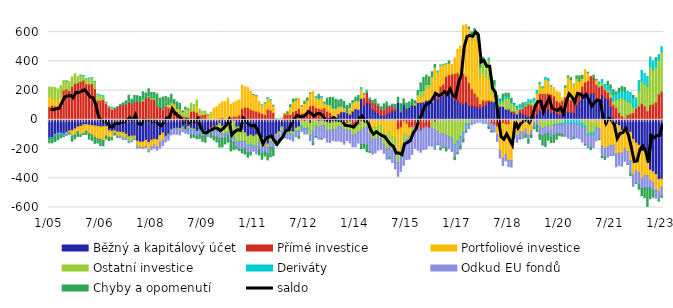
| Category | Běžný a kapitálový účet | Přímé investice | Portfoliové investice | Ostatní investice | Deriváty | Odkud EU fondů | Chyby a opomenutí |
|---|---|---|---|---|---|---|---|
| 2005-01-01 | -124.441 | 89.692 | 68.064 | 66.588 | -3.065 | -1.452 | -29.096 |
| 2005-02-01 | -122.296 | 99.01 | 45.156 | 79.198 | -2.865 | -3.541 | -28.449 |
| 2005-03-01 | -100.116 | 94.332 | 49.935 | 76.179 | -2.888 | -6.071 | -38.963 |
| 2005-04-01 | -90.744 | 93.532 | 38.748 | 79.3 | -4.783 | -8.851 | -32.587 |
| 2005-05-01 | -89.679 | 117.959 | 36.927 | 79.313 | -5.604 | -6.481 | -21.164 |
| 2005-06-01 | -96.933 | 202.87 | 5.517 | 59.672 | -7.103 | -6.984 | -4.94 |
| 2005-07-01 | -88.549 | 209.273 | -9.259 | 55.559 | -6.275 | -2.689 | 1.444 |
| 2005-08-01 | -77.137 | 199.387 | -10.933 | 62.297 | -6.537 | -1.327 | -2.386 |
| 2005-09-01 | -73.567 | 228.287 | -35.533 | 65.063 | -5.857 | -1.155 | -29.976 |
| 2005-10-01 | -62.91 | 249.186 | -38.885 | 66.104 | -4.649 | -1.1 | -22.942 |
| 2005-11-01 | -48.904 | 253.007 | -32.982 | 43.727 | -3.361 | -1.309 | -27.198 |
| 2005-12-01 | -44.466 | 261.769 | -59.739 | 43.581 | 0.188 | -0.136 | -9.091 |
| 2006-01-01 | -35.444 | 269.596 | -56.286 | 33.441 | 0.334 | -5.283 | -3.702 |
| 2006-02-01 | -32.147 | 245.301 | -43.675 | 34.411 | 0.355 | -4.357 | -19.166 |
| 2006-03-01 | -36.206 | 244.754 | -56.378 | 39.852 | 0.352 | -3.833 | -35.595 |
| 2006-04-01 | -38.805 | 247.631 | -65.914 | 40.021 | 0.424 | -0.034 | -35.603 |
| 2006-05-01 | -42.031 | 212.873 | -77.528 | 50.036 | 0.405 | -0.449 | -41.149 |
| 2006-06-01 | -44.576 | 133.768 | -84.697 | 41.047 | 0.366 | -1.174 | -28.492 |
| 2006-07-01 | -48.513 | 133.601 | -85.29 | 34.693 | 0.44 | -1.986 | -41.226 |
| 2006-08-01 | -46.557 | 137.528 | -94.058 | 26.495 | 0.452 | -2.122 | -35.158 |
| 2006-09-01 | -45.661 | 109.828 | -63.673 | 10.207 | 0.458 | -1.335 | -20.96 |
| 2006-10-01 | -73.872 | 85.251 | -45.802 | 4.341 | 0.541 | 0.794 | -21.797 |
| 2006-11-01 | -78.121 | 70.852 | -43.56 | 14.472 | 0.578 | -1.07 | -14.658 |
| 2006-12-01 | -75.213 | 79.119 | -10.072 | -5.807 | 0.679 | -5.366 | -7.696 |
| 2007-01-01 | -83.423 | 89.339 | -17.55 | -11.158 | 0.347 | -6.085 | -1.335 |
| 2007-02-01 | -84.813 | 98.671 | -19.107 | -12.086 | 0.448 | -6.946 | 6.556 |
| 2007-03-01 | -87.76 | 105.815 | -26.532 | -13.184 | 0.651 | -7.674 | 9.675 |
| 2007-04-01 | -98.952 | 109.197 | -8.783 | -20.436 | 0.603 | -6.9 | 19.373 |
| 2007-05-01 | -115.181 | 123.152 | 4.896 | -35.684 | 0.571 | -5.858 | 39.511 |
| 2007-06-01 | -111.687 | 114.746 | -4.774 | -29.762 | 0.383 | -4.332 | 26.147 |
| 2007-07-01 | -110.629 | 121.379 | -8.351 | -11.914 | 0.819 | -5.169 | 44.306 |
| 2007-08-01 | -145.936 | 127.158 | -19.183 | -22.252 | 0.999 | -7.052 | 36.885 |
| 2007-09-01 | -153.084 | 120.714 | -30.091 | -4.203 | 1.127 | -5.774 | 37.181 |
| 2007-10-01 | -151.952 | 129.466 | -38.551 | 13.56 | 1.324 | -5.929 | 47.66 |
| 2007-11-01 | -140.913 | 148.449 | -39.724 | -0.803 | 1.439 | -11.047 | 33.657 |
| 2007-12-01 | -155.189 | 156.264 | -49.215 | 10.789 | 1.297 | -15.26 | 44.127 |
| 2008-01-01 | -139.155 | 140.455 | -45.295 | 10.62 | 1.767 | -18.827 | 34.859 |
| 2008-02-01 | -132.842 | 139.712 | -38.898 | 11.127 | 2.075 | -22.767 | 34.324 |
| 2008-03-01 | -137.494 | 96.223 | -46.738 | -3.323 | 1.501 | -19.929 | 79.272 |
| 2008-04-01 | -107.244 | 84.43 | -40.953 | -8.063 | 1.689 | -37.489 | 62.904 |
| 2008-05-01 | -89.527 | 71.924 | -50.226 | 1.559 | 1.924 | -37.32 | 79.906 |
| 2008-06-01 | -112.332 | 94.203 | 3.421 | 2.039 | 3.157 | -38.891 | 57.377 |
| 2008-07-01 | -98.433 | 86.027 | 19.973 | -3.324 | 2.504 | -37.38 | 42.41 |
| 2008-08-01 | -65.04 | 66.924 | 35.639 | 18.107 | 1.553 | -38.024 | 52.687 |
| 2008-09-01 | -58.791 | 69.933 | 35.691 | 5.165 | 1.635 | -39.124 | 26.412 |
| 2008-10-01 | -56.607 | 57.759 | 18.837 | -3.716 | 1.578 | -38.366 | 44.569 |
| 2008-11-01 | -61.102 | 40.809 | -10.893 | 32.48 | -0.127 | -31.258 | 38.649 |
| 2008-12-01 | -49.23 | 25.008 | -6.429 | 30.696 | -2.607 | -23.117 | 6.001 |
| 2009-01-01 | -65.644 | 20.731 | -6.278 | 54.563 | -3.869 | -15.772 | 11.717 |
| 2009-02-01 | -47.079 | 18.27 | -10.992 | 55.263 | -5.137 | -34.148 | 1.54 |
| 2009-03-01 | -57.657 | 58.69 | -5.413 | 54.971 | -4.729 | -35.77 | -19.497 |
| 2009-04-01 | -63.743 | 58.95 | -8.044 | 44.839 | -4.444 | -29.485 | -14.217 |
| 2009-05-01 | -77.985 | 51.571 | 45.97 | 37.917 | -5.038 | -28.984 | -17.755 |
| 2009-06-01 | -65.636 | 30.221 | 5.275 | 38.37 | -5.444 | -27.952 | -28.868 |
| 2009-07-01 | -70.456 | 33.205 | -9.483 | 25.314 | -5.501 | -27.206 | -34.667 |
| 2009-08-01 | -75.834 | 36.378 | 5.424 | 17.953 | -4.999 | -22.246 | -49.894 |
| 2009-09-01 | -80.317 | -6.348 | 17.867 | 17.248 | -5.31 | -22.428 | 0.062 |
| 2009-10-01 | -50.64 | -11.205 | 47.592 | 3.915 | -6.32 | -26.786 | -27.009 |
| 2009-11-01 | -43.565 | -5.535 | 78.84 | -30.683 | -3.981 | -28.589 | -25.533 |
| 2009-12-01 | -37.928 | -2.79 | 89.442 | -33.301 | -1.288 | -42.635 | -34.419 |
| 2010-01-01 | -23.312 | 6.068 | 102.585 | -51.382 | -0.919 | -53.815 | -56.851 |
| 2010-02-01 | -44.445 | 14.193 | 108.933 | -53.112 | -0.658 | -28.827 | -58.271 |
| 2010-03-01 | -35.774 | -0.011 | 123.526 | -61.178 | -1.262 | -26.046 | -40.267 |
| 2010-04-01 | -24.487 | 5.881 | 141.786 | -62.972 | -1.347 | -18.631 | -45.628 |
| 2010-05-01 | -27.913 | 19.196 | 86.012 | -76.388 | -0.566 | -32.674 | -75.365 |
| 2010-06-01 | -7.947 | 21.93 | 96.747 | -111.192 | -0.789 | -35.653 | -48.362 |
| 2010-07-01 | -50.09 | 22.345 | 105.728 | -100.89 | -0.925 | -34.89 | -13.028 |
| 2010-08-01 | -47.156 | 32.476 | 102.503 | -99.853 | -1.091 | -51.557 | -11.666 |
| 2010-09-01 | -69.148 | 76.49 | 159.368 | -78.352 | -1.329 | -52.604 | -25.988 |
| 2010-10-01 | -89.776 | 85.905 | 139.921 | -57.623 | -1.563 | -50.012 | -35.32 |
| 2010-11-01 | -113.163 | 84.574 | 135.867 | -61.444 | -3.495 | -46.581 | -30.757 |
| 2010-12-01 | -104.18 | 71.479 | 124.358 | -66.593 | -4.748 | -47.499 | -18.159 |
| 2011-01-01 | -112.249 | 62.956 | 109.936 | -62.963 | -3.121 | -36.147 | 1.021 |
| 2011-02-01 | -102.287 | 58.742 | 105.455 | -81.598 | -1.586 | -47.491 | 0.957 |
| 2011-03-01 | -97.652 | 52.066 | 73.661 | -56.029 | -0.433 | -48.688 | -38.032 |
| 2011-04-01 | -124.856 | 42.194 | 59.106 | -56.621 | 1.134 | -48.969 | -39.791 |
| 2011-05-01 | -124.383 | 36.711 | 79.609 | -53.419 | 2.241 | -42.395 | -27.516 |
| 2011-06-01 | -164.887 | 71.785 | 77.176 | -23.461 | 4 | -41.635 | -44.494 |
| 2011-07-01 | -127.374 | 65.259 | 70.992 | -21.748 | 3.104 | -41.441 | -63.168 |
| 2011-08-01 | -144.867 | 48.29 | 49.936 | -16.385 | 1.908 | -30.182 | -54.698 |
| 2011-09-01 | -98.512 | 4.82 | -3.679 | -6.384 | 2.511 | -31.855 | -37.218 |
| 2011-10-01 | -81.308 | 0.486 | 0.231 | -20.111 | 2.322 | -33.011 | -12.202 |
| 2011-11-01 | -48.288 | 0.288 | 14.252 | -26.412 | -0.429 | -45.326 | -13.948 |
| 2011-12-01 | -72.091 | 38.914 | 5.944 | -13.951 | -3.674 | -30.729 | -2.673 |
| 2012-01-01 | -71.765 | 38.831 | 4.734 | -23.268 | -4.179 | -30.664 | 12.183 |
| 2012-02-01 | -79.425 | 36.911 | 53.665 | -15.801 | -1.836 | -38.648 | 12.516 |
| 2012-03-01 | -82.403 | 54.848 | 69.754 | -22.817 | -1.371 | -38.465 | 17.268 |
| 2012-04-01 | -55.856 | 63.965 | 71.522 | -21.527 | -3.649 | -35.084 | 7.786 |
| 2012-05-01 | -47.814 | 77.525 | 69.161 | -28.083 | -5.981 | -30.977 | -13.865 |
| 2012-06-01 | -4.534 | 43.54 | 52.332 | -36.5 | -9.459 | -29.272 | 1.073 |
| 2012-07-01 | -9.854 | 45.889 | 66.56 | -50.026 | -8.184 | -30.291 | 15.359 |
| 2012-08-01 | -2.597 | 49.943 | 83.791 | -52.812 | -6.378 | -34.645 | 16.036 |
| 2012-09-01 | -22.78 | 95.422 | 87.068 | -82.587 | -3.162 | -34.091 | 1.609 |
| 2012-10-01 | -1.424 | 99.684 | 93.652 | -73.576 | -0.025 | -81.64 | -14.498 |
| 2012-11-01 | -2.02 | 83.626 | 69.782 | -36.073 | 5.046 | -76.108 | -6.139 |
| 2012-12-01 | -10.302 | 76.771 | 64.883 | -40.375 | 8.618 | -81.985 | 21.991 |
| 2013-01-01 | -7.036 | 72.978 | 79.588 | -33.535 | 7.59 | -89.164 | -2.661 |
| 2013-02-01 | 13.966 | 68.14 | 31.67 | -41.325 | 4.273 | -82.537 | 2.658 |
| 2013-03-01 | -19.175 | 59.405 | 45.089 | -52.256 | 3.833 | -80.677 | 40.333 |
| 2013-04-01 | -22.668 | 48.652 | 52.743 | -52.117 | 4.515 | -80.167 | 47.997 |
| 2013-05-01 | -16.681 | 29.696 | 50.71 | -48.967 | 5.105 | -75.427 | 67.535 |
| 2013-06-01 | -14.434 | 15.681 | 60.999 | -52.286 | 7.726 | -79.029 | 56.469 |
| 2013-07-01 | 35.854 | 6.124 | 47.443 | -45.769 | 8.072 | -98.553 | 38.278 |
| 2013-08-01 | 51.942 | 3.993 | 36.941 | -48.012 | 8.101 | -101.068 | 37.8 |
| 2013-09-01 | 54.846 | -11.589 | 24.86 | -54.755 | 4.982 | -100.282 | 40.799 |
| 2013-10-01 | 48.645 | -24.457 | 2.97 | -43.786 | 4.064 | -74.313 | 43.272 |
| 2013-11-01 | 38.337 | -14.525 | 44.991 | -59.771 | 4.568 | -83.365 | 22.979 |
| 2013-12-01 | 60.652 | -47.192 | 58.065 | -56.7 | 4.737 | -80.947 | 7.655 |
| 2014-01-01 | 76.1 | -40.905 | 53.407 | -60.214 | 5.741 | -83.749 | 19.85 |
| 2014-02-01 | 70.566 | -30.882 | 60.06 | -51.432 | 6.611 | -76.515 | 29.287 |
| 2014-03-01 | 146.772 | -15.616 | 66.465 | -54.831 | 7.415 | -98.498 | -29.104 |
| 2014-04-01 | 97.569 | 53.391 | 23.347 | -55.562 | 7.724 | -112.203 | -26.516 |
| 2014-05-01 | 119.193 | 71.316 | 2.905 | -51.102 | 9.334 | -123.624 | -43.785 |
| 2014-06-01 | 110.206 | 32.871 | -42.442 | -52.361 | 6.478 | -121.857 | -6.196 |
| 2014-07-01 | 69.905 | 49.639 | -50.674 | -80.693 | 7.26 | -103.049 | 6.148 |
| 2014-08-01 | 61.301 | 55.79 | -52.997 | -79.981 | 7.601 | -93.214 | 16.406 |
| 2014-09-01 | 46.655 | 52.91 | -40.429 | -75.705 | 6.234 | -91.531 | 2.282 |
| 2014-10-01 | 30.752 | 43.53 | -37.303 | -89.641 | 5.434 | -74.275 | 9.917 |
| 2014-11-01 | 27.426 | 42.176 | -82.1 | -86.722 | 5.718 | -59.899 | 34.384 |
| 2014-12-01 | 40.201 | 51.738 | -101.53 | -99.551 | 6.046 | -67.819 | 23.393 |
| 2015-01-01 | 47.082 | 45.3 | -81.788 | -106.95 | 4.147 | -67.991 | -11.16 |
| 2015-02-01 | 64.438 | 31.272 | -113.515 | -99.443 | 3.488 | -79.369 | 8.619 |
| 2015-03-01 | 61.952 | 17.508 | -123.215 | -107.479 | 3.868 | -105.434 | 22.173 |
| 2015-04-01 | 117.258 | -67.596 | -152.951 | -71.69 | -1.045 | -92.46 | 37.342 |
| 2015-05-01 | 53.636 | -54.654 | -132.3 | -70.797 | -3.562 | -91.157 | 56.598 |
| 2015-06-01 | 105.409 | -13.665 | -88.369 | -68.269 | -1.026 | -139.519 | 38.005 |
| 2015-07-01 | 75.564 | -27.266 | -75.008 | -30.685 | -0.381 | -138.461 | 38.228 |
| 2015-08-01 | 86.554 | -54.393 | -51.71 | -16.126 | 0.717 | -146.704 | 35.573 |
| 2015-09-01 | 102.7 | -51.537 | -7.167 | -20.983 | 2.751 | -156.77 | 35.952 |
| 2015-10-01 | 100.512 | -41.655 | 13.221 | -1.606 | 3.704 | -152.375 | 13.064 |
| 2015-11-01 | 118.661 | -53.238 | 44.671 | 8.674 | 3.6 | -154.449 | 24.815 |
| 2015-12-01 | 119.739 | -74.768 | 31.132 | 43.825 | 4.77 | -147.045 | 53.675 |
| 2016-01-01 | 122.887 | -55.857 | 40.752 | 36.059 | 4.631 | -147.32 | 85.377 |
| 2016-02-01 | 133.482 | -49.07 | 82.789 | 23.449 | 3.924 | -150.305 | 62.751 |
| 2016-03-01 | 134.43 | -55.846 | 83.104 | 24.49 | 2.611 | -122.251 | 49.212 |
| 2016-04-01 | 120.546 | -3.979 | 173.917 | -53.585 | 6.325 | -123.237 | 28.108 |
| 2016-05-01 | 196.511 | -15.752 | 160.145 | -51.231 | 8.54 | -136.187 | 14.039 |
| 2016-06-01 | 140.692 | 31.181 | 155.436 | -78.833 | 6.54 | -87.27 | -4.712 |
| 2016-07-01 | 164.713 | 65.15 | 142.588 | -97.202 | 3.289 | -99.835 | -8.724 |
| 2016-08-01 | 163.423 | 80.401 | 135.359 | -92.549 | 0.488 | -95.368 | -1.85 |
| 2016-09-01 | 175.369 | 122.407 | 85.62 | -107.326 | 0.661 | -86.372 | -19.235 |
| 2016-10-01 | 180.263 | 127.947 | 78.58 | -113.728 | -0.733 | -81.848 | 15.853 |
| 2016-11-01 | 156.2 | 156.826 | 65.258 | -128.332 | -5.671 | -78.401 | -1.556 |
| 2016-12-01 | 136.832 | 180.321 | 105.962 | -169.67 | -11.291 | -76.701 | -14.716 |
| 2017-01-01 | 133.425 | 187.826 | 160.898 | -144.46 | -10.034 | -73.271 | -5.362 |
| 2017-02-01 | 115.392 | 179.974 | 210.441 | -113.68 | -11.159 | -56.223 | -19.254 |
| 2017-03-01 | 107.276 | 209.733 | 328.85 | -82.812 | -11.446 | -41.029 | -16.141 |
| 2017-04-01 | 121.609 | 175.964 | 353.334 | -27.682 | -11.77 | -41.172 | -4.634 |
| 2017-05-01 | 97.526 | 157.505 | 369.908 | -26.506 | -7.82 | -26.119 | 10.244 |
| 2017-06-01 | 98.914 | 112.822 | 334.404 | 22.066 | -6.072 | -27.586 | 33.435 |
| 2017-07-01 | 91.96 | 89.781 | 388.429 | 29.37 | -1.827 | -23.462 | 23.926 |
| 2017-08-01 | 88.999 | 67.872 | 380.234 | 32.123 | 3.503 | -18.012 | 24.417 |
| 2017-09-01 | 80.144 | 29.981 | 179.623 | 71.124 | 1.883 | -15.706 | 45.118 |
| 2017-10-01 | 92.476 | 43.031 | 182.898 | 91.368 | 1.516 | -24.994 | 16.298 |
| 2017-11-01 | 100.507 | 29.294 | 159.341 | 84.254 | 6.535 | -24.154 | 6.624 |
| 2017-12-01 | 124.017 | 11.313 | 142.304 | 130.468 | 14.19 | -51.222 | -8.371 |
| 2018-01-01 | 127.634 | -26.749 | 49.255 | 104.319 | 15.506 | -52.138 | -5.669 |
| 2018-02-01 | 123.485 | -32.982 | 34.209 | 79.449 | 15.373 | -50.137 | 15.613 |
| 2018-03-01 | 73.836 | -48.675 | -52.463 | 52.997 | 14.999 | -46.216 | 25.27 |
| 2018-04-01 | 92.289 | -33.486 | -175.152 | 23.497 | 16.822 | -52.992 | 10.32 |
| 2018-05-01 | 91.283 | -24.669 | -238.743 | 35.772 | 14.49 | -49.516 | 34.633 |
| 2018-06-01 | 72.298 | -30.602 | -207.118 | 75.708 | 15.957 | -44.053 | 17.72 |
| 2018-07-01 | 72.65 | -31.386 | -246.201 | 76.263 | 13.683 | -42.175 | 19.565 |
| 2018-08-01 | 50.358 | 9.218 | -278.38 | 53.876 | 9.846 | -45.127 | 24.33 |
| 2018-09-01 | 40.95 | 18.065 | -81.188 | 41.743 | 9.468 | -45.573 | 3.018 |
| 2018-10-01 | 39.403 | -1.692 | -103.173 | 32.72 | 18.734 | -49.326 | 3.725 |
| 2018-11-01 | 51.333 | 19.077 | -80.091 | 13.863 | 20.707 | -48.723 | -2.342 |
| 2018-12-01 | 36.759 | 39.018 | -81.966 | -5.333 | 15.291 | -39.836 | 24.012 |
| 2019-01-01 | 31.57 | 61.057 | -64.247 | 11.063 | 16.34 | -38.203 | -19.433 |
| 2019-02-01 | 23.05 | 85.668 | -106.054 | 12.107 | 17.864 | -32.145 | -22.263 |
| 2019-03-01 | 24.522 | 77.466 | -72.715 | 15.896 | 17.873 | -33.178 | -15.022 |
| 2019-04-01 | 24.091 | 67.536 | -17.209 | 38.622 | 17.703 | -34.024 | -9.865 |
| 2019-05-01 | 40.757 | 77.748 | 59.234 | 8.623 | 15.443 | -36.703 | -43.544 |
| 2019-06-01 | 66.681 | 111.981 | 69.047 | -45.561 | 9.393 | -55.392 | -32.626 |
| 2019-07-01 | 50.103 | 129.782 | 38.456 | -58.479 | 9.416 | -50.776 | -63.583 |
| 2019-08-01 | 64.491 | 114.258 | 98.383 | -50.282 | 13.325 | -48.444 | -84.115 |
| 2019-09-01 | 72.03 | 108.771 | 87.17 | -39.67 | 14.68 | -52.044 | -47.822 |
| 2019-10-01 | 50.235 | 123.967 | 57.392 | -69.581 | 2.323 | -49.785 | -36.933 |
| 2019-11-01 | 60.867 | 102.454 | 57.498 | -31.492 | -2.588 | -71.916 | -48.129 |
| 2019-12-01 | 43.649 | 86.755 | 63.387 | -30.751 | -1.041 | -65.675 | -35.26 |
| 2020-01-01 | 30.944 | 87.462 | 68.822 | -25.925 | -7.146 | -61.675 | -14.409 |
| 2020-02-01 | 42.54 | 88.579 | 21.108 | -23.941 | -8.596 | -68.941 | -10.751 |
| 2020-03-01 | 84.8 | 70.824 | 65.072 | 4.758 | -24.849 | -88.452 | 7.011 |
| 2020-04-01 | 53.26 | 91.486 | 149.002 | -2.098 | -26.494 | -96.719 | 6.152 |
| 2020-05-01 | 49.414 | 85.283 | 122.219 | 18.683 | -28.165 | -106.084 | 12.715 |
| 2020-06-01 | 49.58 | 78.499 | 106.958 | 11.092 | -25.934 | -93.112 | -9.71 |
| 2020-07-01 | 99.523 | 48.737 | 121.156 | 14.986 | -29.591 | -93.97 | 16.338 |
| 2020-08-01 | 125.087 | 61.963 | 70.149 | 9.972 | -32.196 | -96.79 | 33.565 |
| 2020-09-01 | 185.846 | 42.042 | 55.539 | -22.916 | -23.943 | -104.697 | 21.024 |
| 2020-10-01 | 180.5 | 77.975 | 84.895 | -42.865 | -16.605 | -110.723 | -3.462 |
| 2020-11-01 | 174.305 | 93.258 | 55.707 | -96.103 | -13.97 | -83.215 | 2.552 |
| 2020-12-01 | 180.467 | 115.378 | -16.46 | -74.819 | -10.796 | -85.479 | -17.155 |
| 2021-01-01 | 179.159 | 107.56 | -23.031 | -62.541 | -16.516 | -87.532 | 18.654 |
| 2021-02-01 | 145.561 | 97.006 | 31.237 | -50.696 | -11.263 | -81.996 | 2.376 |
| 2021-03-01 | 137.701 | 87.17 | -59.215 | 21.855 | 13.582 | -71.987 | -3.283 |
| 2021-04-01 | 170.383 | 65.27 | -177.21 | 18.42 | 21.355 | -73.256 | -8.824 |
| 2021-05-01 | 149.339 | 58.714 | -195.615 | 9.023 | 26.058 | -60.932 | -15.387 |
| 2021-06-01 | 141.115 | 46.782 | -184.037 | 20.205 | 32.921 | -72.913 | 22.502 |
| 2021-07-01 | 86.756 | 65.613 | -174.354 | 26.128 | 41.657 | -71.386 | 18.982 |
| 2021-08-01 | 16.586 | 84.124 | -173.326 | 28.727 | 43.849 | -71.292 | 32.694 |
| 2021-09-01 | -31.59 | 83.596 | -202.021 | 56.574 | 39.608 | -88.13 | 11.131 |
| 2021-10-01 | -40.916 | 50.659 | -186.34 | 94.832 | 46.781 | -84.575 | 23.63 |
| 2021-11-01 | -73.128 | 27.09 | -153.835 | 125.678 | 51.508 | -90.818 | 23.067 |
| 2021-12-01 | -64.252 | 12.692 | -132.625 | 126.003 | 58.196 | -86.858 | 24.247 |
| 2022-01-01 | -74.084 | 33.582 | -141.415 | 91.709 | 69.383 | -87.785 | -1.863 |
| 2022-02-01 | -84.649 | 41.217 | -193.486 | 75.967 | 69.828 | -90.81 | -13.36 |
| 2022-03-01 | -133.875 | 48.225 | -240.331 | 39.474 | 65.348 | -80.11 | 13.238 |
| 2022-04-01 | -159.227 | 80.271 | -188.034 | 4.094 | 66.268 | -86.386 | -1.874 |
| 2022-05-01 | -174.514 | 93.62 | -185.245 | 104.289 | 70.739 | -85.421 | -29.743 |
| 2022-06-01 | -217.069 | 112.261 | -182.862 | 150.559 | 75.107 | -69.794 | -50.214 |
| 2022-07-01 | -216.171 | 93.764 | -165.582 | 153.228 | 71.473 | -84.669 | -66.349 |
| 2022-08-01 | -265.032 | 60.818 | -115.436 | 168.749 | 66.936 | -84.473 | -128.252 |
| 2022-09-01 | -344.386 | 104.071 | -69.822 | 258.354 | 67.566 | -54.118 | -71.744 |
| 2022-10-01 | -355.689 | 107.829 | -73.549 | 234.446 | 61.484 | -57.149 | -43.101 |
| 2022-11-01 | -374.639 | 121.712 | -101.073 | 240.58 | 47.971 | -61.054 | 15.106 |
| 2022-12-01 | -407.864 | 176.933 | -80.5 | 231.76 | 37.748 | -60.304 | -7.251 |
| 2023-01-01 | -404.664 | 192.64 | -54.747 | 272.872 | 34.328 | -61.301 | -10.385 |